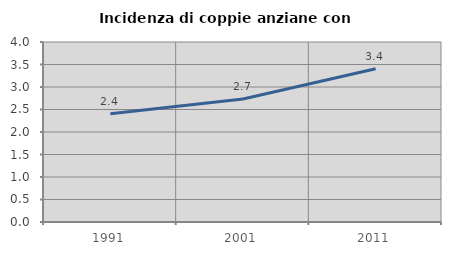
| Category | Incidenza di coppie anziane con figli |
|---|---|
| 1991.0 | 2.405 |
| 2001.0 | 2.733 |
| 2011.0 | 3.404 |